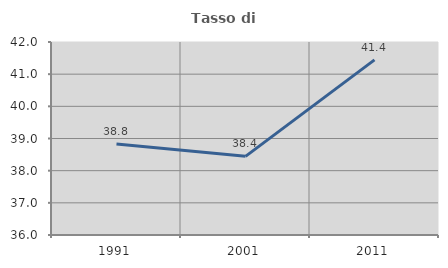
| Category | Tasso di occupazione   |
|---|---|
| 1991.0 | 38.832 |
| 2001.0 | 38.445 |
| 2011.0 | 41.444 |